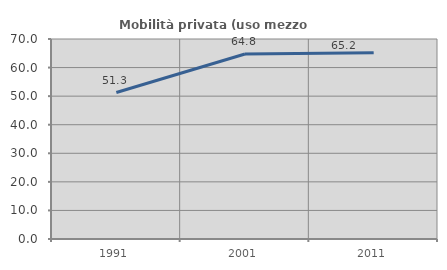
| Category | Mobilità privata (uso mezzo privato) |
|---|---|
| 1991.0 | 51.254 |
| 2001.0 | 64.765 |
| 2011.0 | 65.176 |